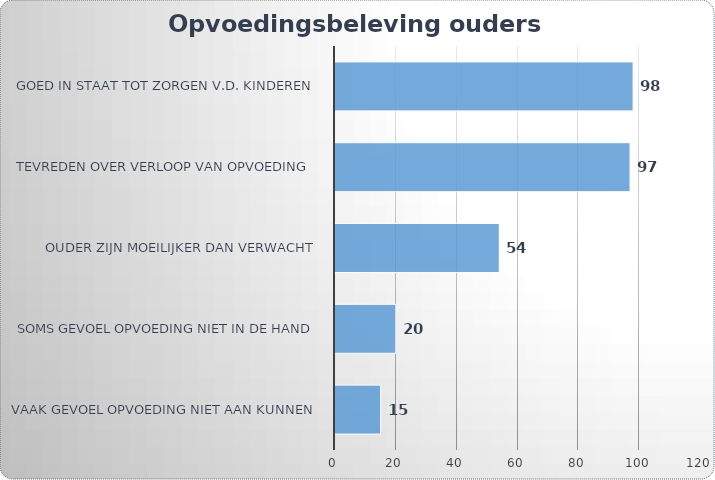
| Category | % |
|---|---|
| Vaak gevoel opvoeding niet aan kunnen | 15 |
| Soms gevoel opvoeding niet in de hand | 20 |
| Ouder zijn moeilijker dan verwacht | 54 |
| Tevreden over verloop van opvoeding  | 97 |
| Goed in staat tot zorgen v.d. Kinderen | 98 |